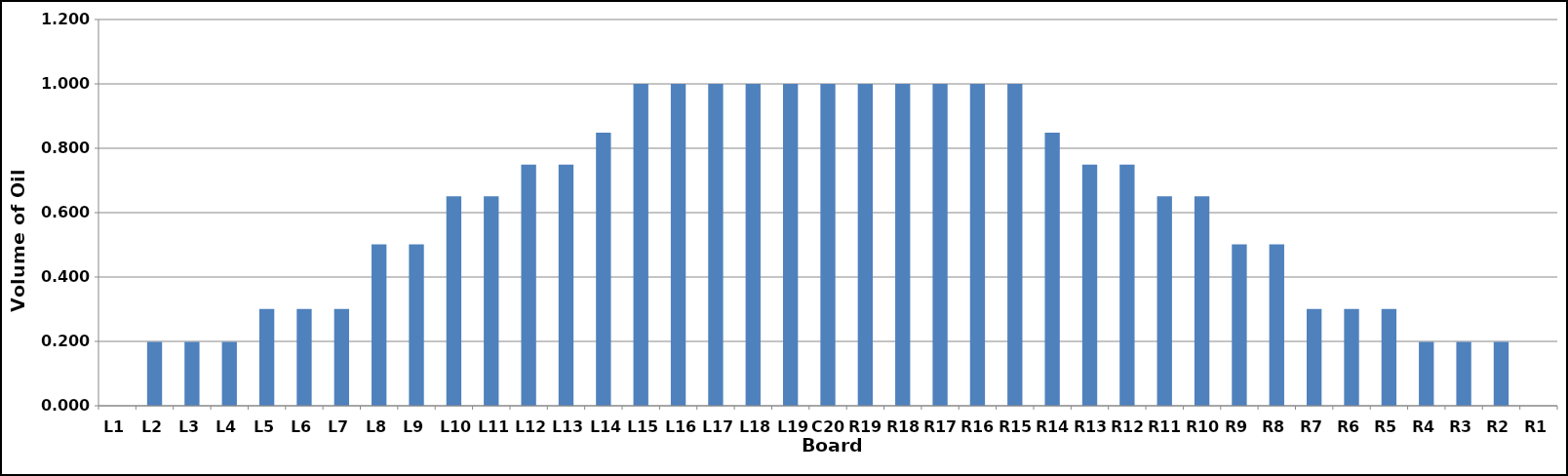
| Category | Series 0 |
|---|---|
| L1 | 0 |
| L2 | 0.199 |
| L3 | 0.199 |
| L4 | 0.199 |
| L5 | 0.301 |
| L6 | 0.301 |
| L7 | 0.301 |
| L8 | 0.501 |
| L9 | 0.501 |
| L10 | 0.651 |
| L11 | 0.651 |
| L12 | 0.749 |
| L13 | 0.749 |
| L14 | 0.848 |
| L15 | 1 |
| L16 | 1 |
| L17 | 1 |
| L18 | 1 |
| L19 | 1 |
| C20 | 1 |
| R19 | 1 |
| R18 | 1 |
| R17 | 1 |
| R16 | 1 |
| R15 | 1 |
| R14 | 0.848 |
| R13 | 0.749 |
| R12 | 0.749 |
| R11 | 0.651 |
| R10 | 0.651 |
| R9 | 0.501 |
| R8 | 0.501 |
| R7 | 0.301 |
| R6 | 0.301 |
| R5 | 0.301 |
| R4 | 0.199 |
| R3 | 0.199 |
| R2 | 0.199 |
| R1 | 0 |